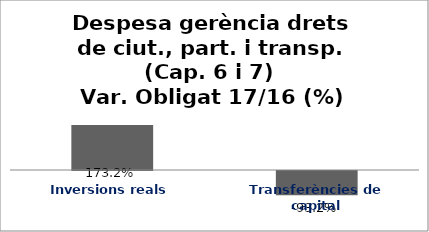
| Category | Series 0 |
|---|---|
| Inversions reals | 1.732 |
| Transferències de capital | -0.932 |